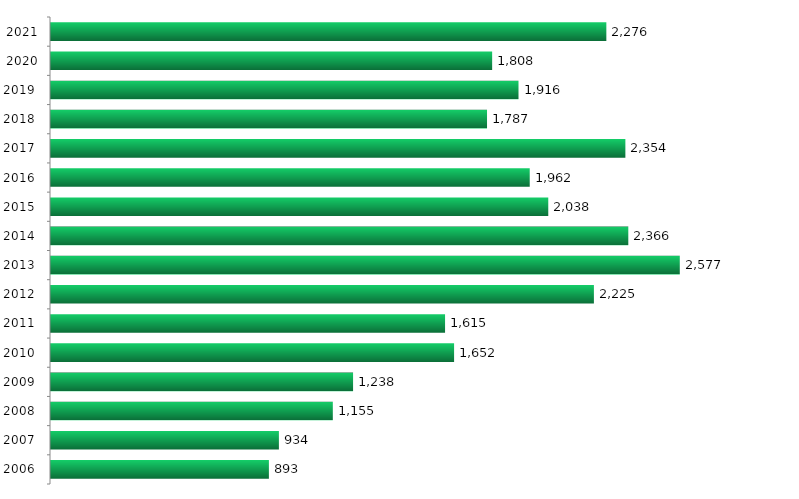
| Category | Ingressantes |
|---|---|
| 2006.0 | 893 |
| 2007.0 | 934 |
| 2008.0 | 1155 |
| 2009.0 | 1238 |
| 2010.0 | 1652 |
| 2011.0 | 1615 |
| 2012.0 | 2225 |
| 2013.0 | 2577 |
| 2014.0 | 2366 |
| 2015.0 | 2038 |
| 2016.0 | 1962 |
| 2017.0 | 2354 |
| 2018.0 | 1787 |
| 2019.0 | 1916 |
| 2020.0 | 1808 |
| 2021.0 | 2276 |